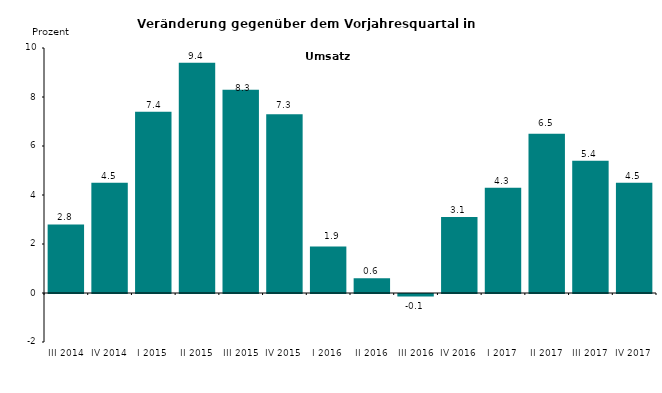
| Category | Series 0 |
|---|---|
| III 2014 | 2.8 |
| IV 2014 | 4.5 |
| I 2015 | 7.4 |
| II 2015 | 9.4 |
| III 2015 | 8.3 |
| IV 2015 | 7.3 |
| I 2016 | 1.9 |
| II 2016 | 0.6 |
| III 2016 | -0.1 |
| IV 2016 | 3.1 |
| I 2017 | 4.3 |
| II 2017 | 6.5 |
| III 2017 | 5.4 |
| IV 2017 | 4.5 |